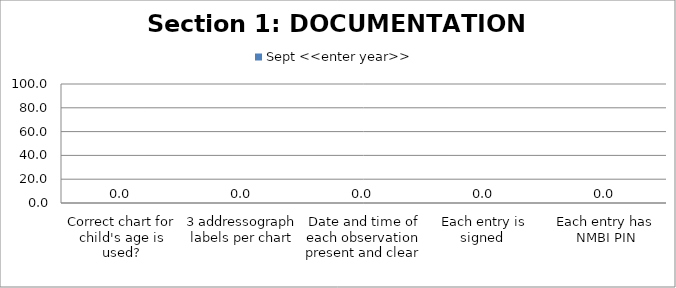
| Category | Sept <<enter year>> |
|---|---|
| Correct chart for child's age is used? | 0 |
| 3 addressograph labels per chart | 0 |
| Date and time of each observation present and clear  | 0 |
| Each entry is signed  | 0 |
| Each entry has NMBI PIN | 0 |